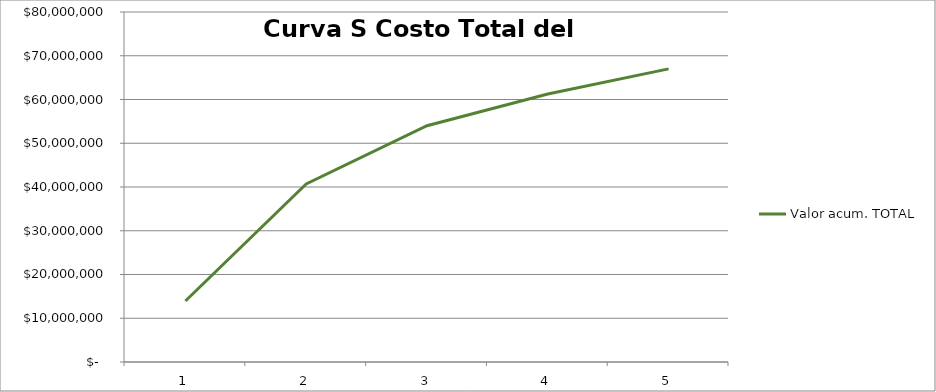
| Category | Valor acum. TOTAL |
|---|---|
| 0 | 13934035.3 |
| 1 | 40706240 |
| 2 | 53995760 |
| 3 | 61249880 |
| 4 | 67000000 |